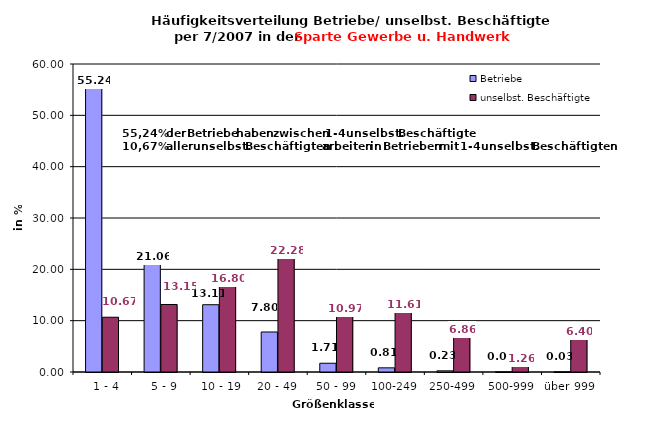
| Category | Betriebe | unselbst. Beschäftigte |
|---|---|---|
|   1 - 4 | 55.241 | 10.667 |
|   5 - 9 | 21.057 | 13.149 |
|  10 - 19 | 13.11 | 16.801 |
| 20 - 49 | 7.797 | 22.284 |
| 50 - 99 | 1.707 | 10.966 |
| 100-249 | 0.812 | 11.606 |
| 250-499 | 0.226 | 6.86 |
| 500-999 | 0.025 | 1.264 |
| über 999 | 0.025 | 6.402 |